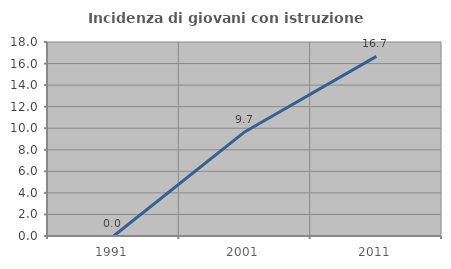
| Category | Incidenza di giovani con istruzione universitaria |
|---|---|
| 1991.0 | 0 |
| 2001.0 | 9.677 |
| 2011.0 | 16.667 |